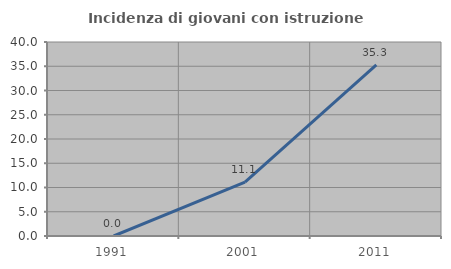
| Category | Incidenza di giovani con istruzione universitaria |
|---|---|
| 1991.0 | 0 |
| 2001.0 | 11.111 |
| 2011.0 | 35.294 |